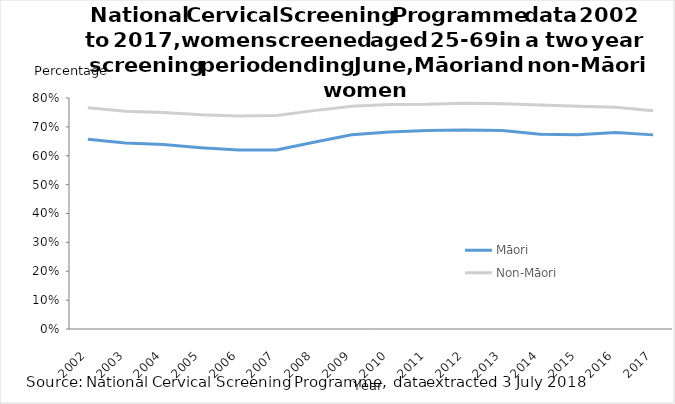
| Category | Māori | Non-Māori |
|---|---|---|
| 2002.0 | 0.657 | 0.767 |
| 2003.0 | 0.644 | 0.754 |
| 2004.0 | 0.639 | 0.75 |
| 2005.0 | 0.628 | 0.742 |
| 2006.0 | 0.62 | 0.737 |
| 2007.0 | 0.62 | 0.74 |
| 2008.0 | 0.647 | 0.756 |
| 2009.0 | 0.673 | 0.771 |
| 2010.0 | 0.683 | 0.778 |
| 2011.0 | 0.687 | 0.778 |
| 2012.0 | 0.689 | 0.782 |
| 2013.0 | 0.688 | 0.78 |
| 2014.0 | 0.675 | 0.776 |
| 2015.0 | 0.673 | 0.772 |
| 2016.0 | 0.68 | 0.768 |
| 2017.0 | 0.672 | 0.756 |